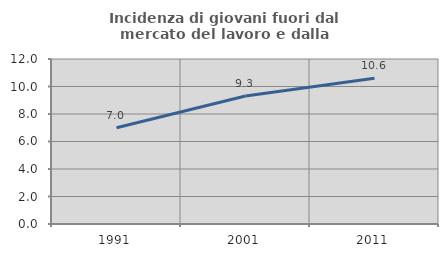
| Category | Incidenza di giovani fuori dal mercato del lavoro e dalla formazione  |
|---|---|
| 1991.0 | 7.004 |
| 2001.0 | 9.313 |
| 2011.0 | 10.606 |